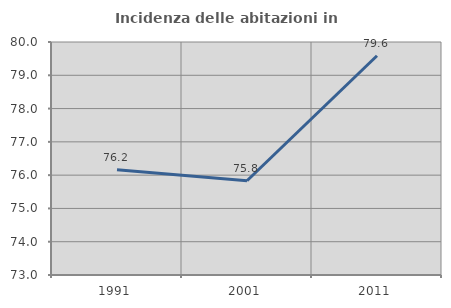
| Category | Incidenza delle abitazioni in proprietà  |
|---|---|
| 1991.0 | 76.164 |
| 2001.0 | 75.831 |
| 2011.0 | 79.588 |